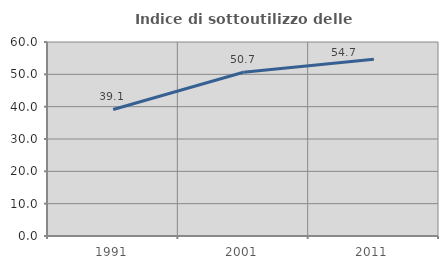
| Category | Indice di sottoutilizzo delle abitazioni  |
|---|---|
| 1991.0 | 39.13 |
| 2001.0 | 50.661 |
| 2011.0 | 54.661 |